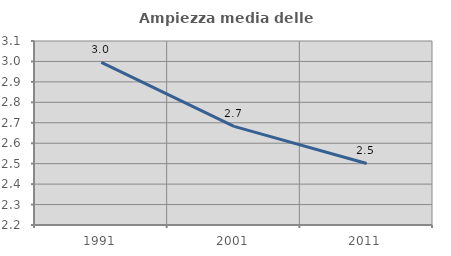
| Category | Ampiezza media delle famiglie |
|---|---|
| 1991.0 | 2.996 |
| 2001.0 | 2.682 |
| 2011.0 | 2.501 |